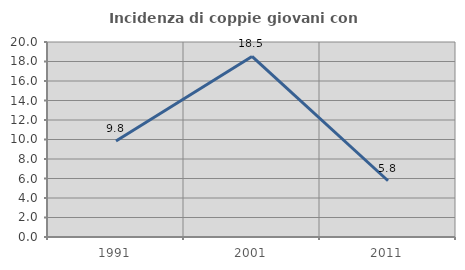
| Category | Incidenza di coppie giovani con figli |
|---|---|
| 1991.0 | 9.836 |
| 2001.0 | 18.519 |
| 2011.0 | 5.769 |